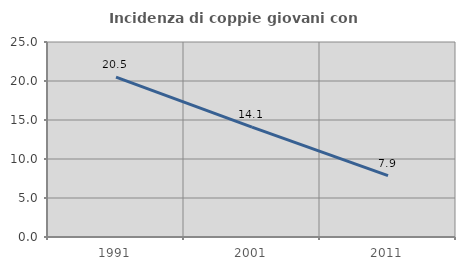
| Category | Incidenza di coppie giovani con figli |
|---|---|
| 1991.0 | 20.494 |
| 2001.0 | 14.095 |
| 2011.0 | 7.859 |